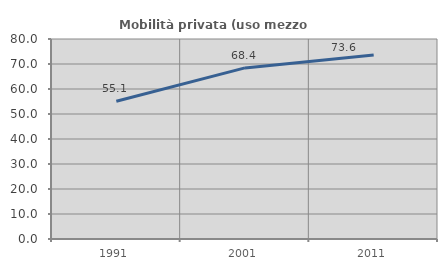
| Category | Mobilità privata (uso mezzo privato) |
|---|---|
| 1991.0 | 55.118 |
| 2001.0 | 68.447 |
| 2011.0 | 73.624 |